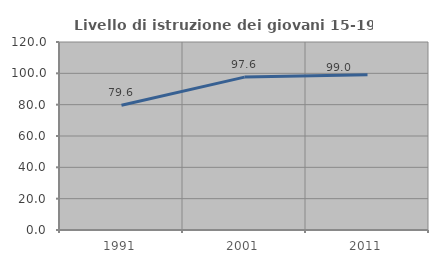
| Category | Livello di istruzione dei giovani 15-19 anni |
|---|---|
| 1991.0 | 79.596 |
| 2001.0 | 97.583 |
| 2011.0 | 99.05 |